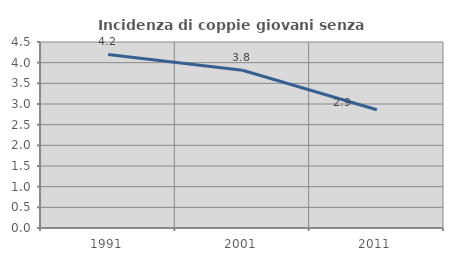
| Category | Incidenza di coppie giovani senza figli |
|---|---|
| 1991.0 | 4.198 |
| 2001.0 | 3.818 |
| 2011.0 | 2.86 |